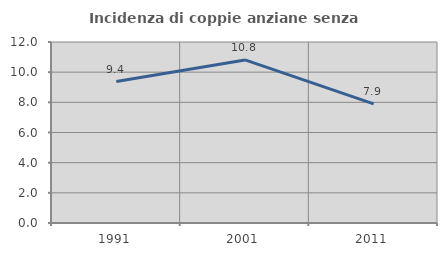
| Category | Incidenza di coppie anziane senza figli  |
|---|---|
| 1991.0 | 9.375 |
| 2001.0 | 10.811 |
| 2011.0 | 7.895 |